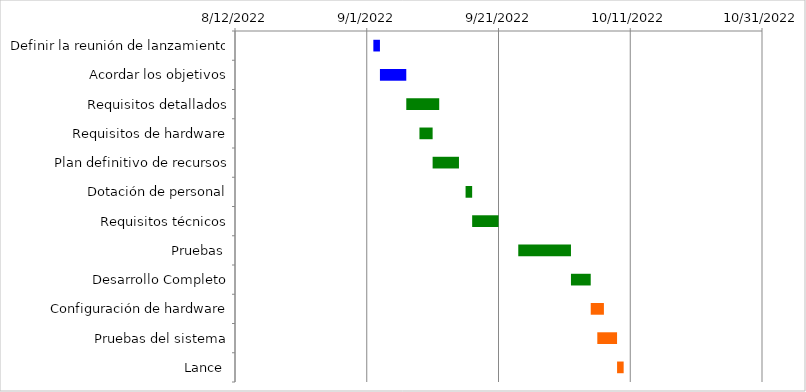
| Category | Inicio | Días |
|---|---|---|
| Definir la reunión de lanzamiento | 9/2/22 | 1 |
| Acordar los objetivos | 9/3/22 | 4 |
| Requisitos detallados | 9/7/22 | 5 |
| Requisitos de hardware | 9/9/22 | 2 |
| Plan definitivo de recursos | 9/11/22 | 4 |
| Dotación de personal | 9/16/22 | 1 |
| Requisitos técnicos | 9/17/22 | 4 |
| Pruebas | 9/24/22 | 8 |
| Desarrollo Completo | 10/2/22 | 3 |
| Configuración de hardware | 10/5/22 | 2 |
| Pruebas del sistema | 10/6/22 | 3 |
| Lance | 10/9/22 | 1 |